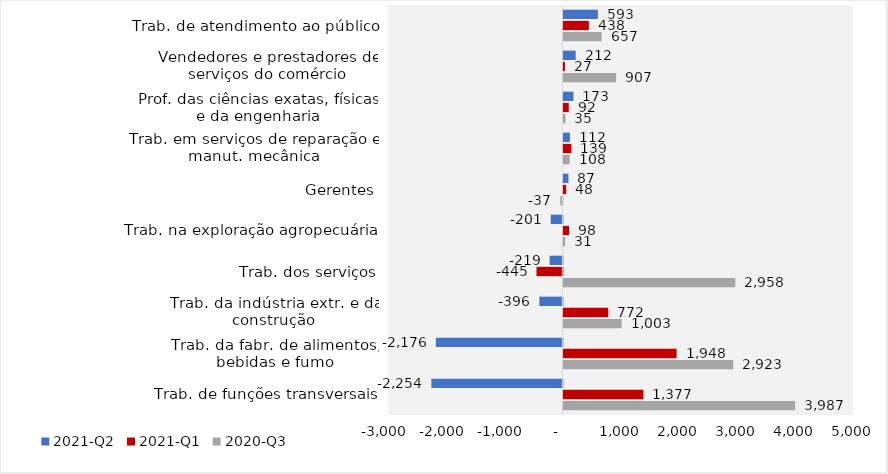
| Category | 2020-Q3 | 2021-Q1 | 2021-Q2 |
|---|---|---|---|
| Trab. de funções transversais | 3987 | 1377 | -2254 |
| Trab. da fabr. de alimentos, bebidas e fumo | 2923 | 1948 | -2176 |
| Trab. da indústria extr. e da construção | 1003 | 772 | -396 |
| Trab. dos serviços | 2958 | -445 | -219 |
| Trab. na exploração agropecuária | 31 | 98 | -201 |
| Gerentes | -37 | 48 | 87 |
| Trab. em serviços de reparação e manut. mecânica | 108 | 139 | 112 |
| Prof. das ciências exatas, físicas e da engenharia | 35 | 92 | 173 |
| Vendedores e prestadores de serviços do comércio | 907 | 27 | 212 |
| Trab. de atendimento ao público | 657 | 438 | 593 |